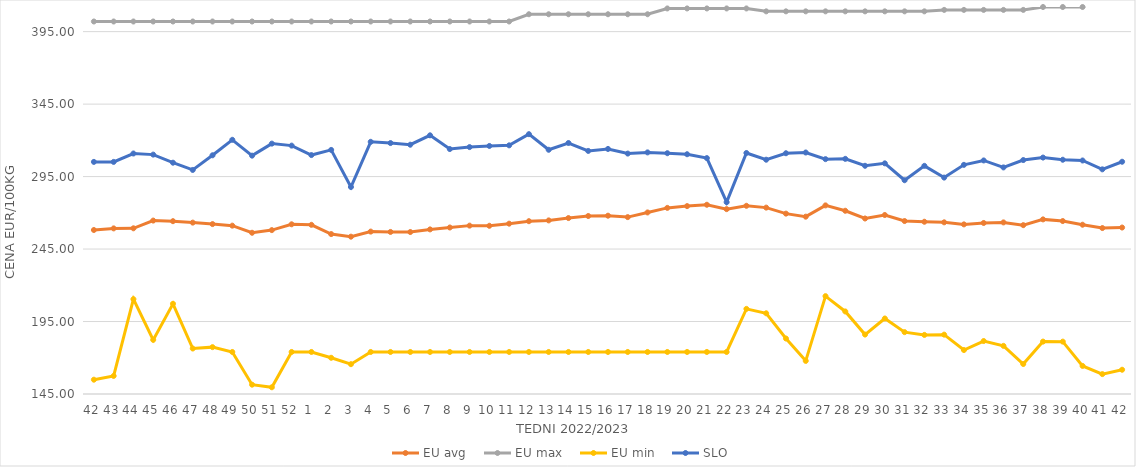
| Category | EU avg | EU max | EU min | SLO |
|---|---|---|---|---|
| 42.0 | 258.146 | 402 | 154.869 | 305.13 |
| 43.0 | 259.256 | 402 | 157.459 | 305.13 |
| 44.0 | 259.32 | 402 | 210.415 | 310.93 |
| 45.0 | 264.649 | 402 | 182.35 | 310.16 |
| 46.0 | 264.228 | 402 | 207.247 | 304.58 |
| 47.0 | 263.24 | 402 | 176.378 | 299.59 |
| 48.0 | 262.225 | 402 | 177.332 | 309.69 |
| 49.0 | 261.152 | 402 | 174 | 320.38 |
| 50.0 | 256.24 | 402 | 151.434 | 309.44 |
| 51.0 | 258.071 | 402 | 149.638 | 317.74 |
| 52.0 | 262.088 | 402 | 174 | 316.36 |
| 1.0 | 261.716 | 402 | 174 | 309.84 |
| 2.0 | 255.331 | 402 | 169.983 | 313.4 |
| 3.0 | 253.546 | 402 | 165.574 | 287.81 |
| 4.0 | 257.051 | 402 | 174 | 318.98 |
| 5.0 | 256.808 | 402 | 174 | 318.13 |
| 6.0 | 256.75 | 402 | 174 | 316.99 |
| 7.0 | 258.565 | 402 | 174 | 323.47 |
| 8.0 | 259.872 | 402 | 174 | 314 |
| 9.0 | 261.164 | 402 | 174 | 315.35 |
| 10.0 | 261.06 | 402 | 174 | 316.13 |
| 11.0 | 262.513 | 402 | 174 | 316.55 |
| 12.0 | 264.228 | 407 | 174 | 324.27 |
| 13.0 | 264.768 | 407 | 174 | 313.49 |
| 14.0 | 266.385 | 407 | 174 | 318.17 |
| 15.0 | 267.797 | 407 | 174 | 312.7 |
| 16.0 | 268.021 | 407 | 174 | 314.07 |
| 17.0 | 267.041 | 407 | 174 | 310.87 |
| 18.0 | 270.255 | 407 | 174 | 311.69 |
| 19.0 | 273.406 | 411 | 174 | 311.13 |
| 20.0 | 274.631 | 411 | 174 | 310.42 |
| 21.0 | 275.561 | 411 | 174 | 307.76 |
| 22.0 | 272.542 | 411 | 174 | 277.34 |
| 23.0 | 274.85 | 411 | 203.728 | 311.28 |
| 24.0 | 273.59 | 409 | 200.686 | 306.64 |
| 25.0 | 269.439 | 409 | 183.275 | 311.1 |
| 26.0 | 267.345 | 409 | 167.858 | 311.62 |
| 27.0 | 275.123 | 409 | 212.506 | 307.04 |
| 28.0 | 271.42 | 409 | 201.945 | 307.23 |
| 29.0 | 266.08 | 409 | 186.018 | 302.45 |
| 30.0 | 268.49 | 409 | 197.093 | 304.14 |
| 31.0 | 264.334 | 409 | 187.684 | 292.49 |
| 32.0 | 263.844 | 409 | 185.774 | 302.41 |
| 33.0 | 263.441 | 410 | 185.951 | 294.3 |
| 34.0 | 262.028 | 410 | 175.332 | 303.1 |
| 35.0 | 262.997 | 410 | 181.543 | 306.13 |
| 36.0 | 263.389 | 410 | 178.207 | 301.32 |
| 37.0 | 261.486 | 410 | 165.697 | 306.4 |
| 38.0 | 265.47 | 412 | 181.159 | 308.12 |
| 39.0 | 264.316 | 412 | 181.124 | 306.62 |
| 40.0 | 261.789 | 412 | 164.37 | 306.1 |
| 41.0 | 259.491 | 419 | 158.728 | 300 |
| 42.0 | 259.848 | 419 | 161.736 | 305.24 |